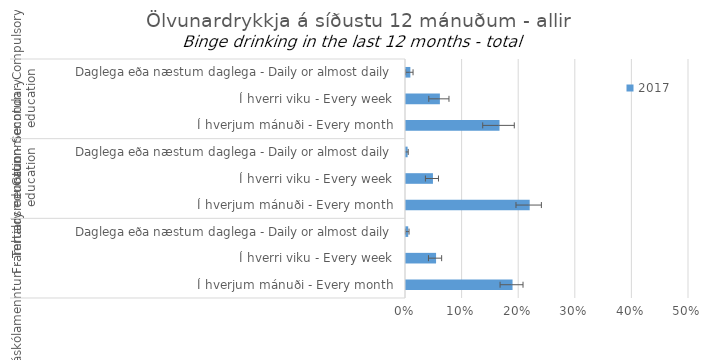
| Category | 2017 |
|---|---|
| 0 | 0.008 |
| 1 | 0.06 |
| 2 | 0.165 |
| 3 | 0.003 |
| 4 | 0.048 |
| 5 | 0.219 |
| 6 | 0.004 |
| 7 | 0.053 |
| 8 | 0.188 |